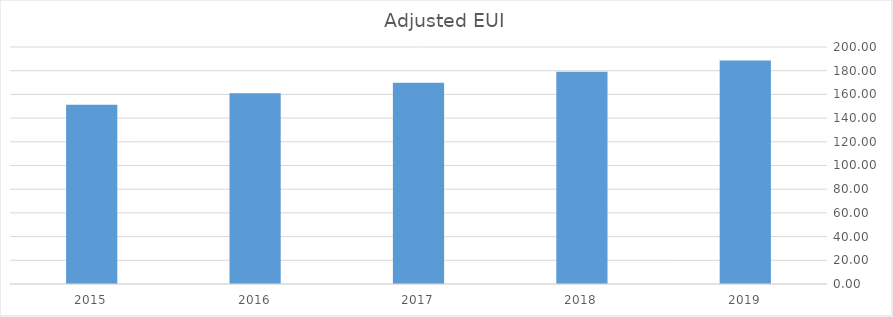
| Category | Series 0 |
|---|---|
| 2019.0 | 188.504 |
| 2018.0 | 179.081 |
| 2017.0 | 169.921 |
| 2016.0 | 161.011 |
| 2015.0 | 151.319 |